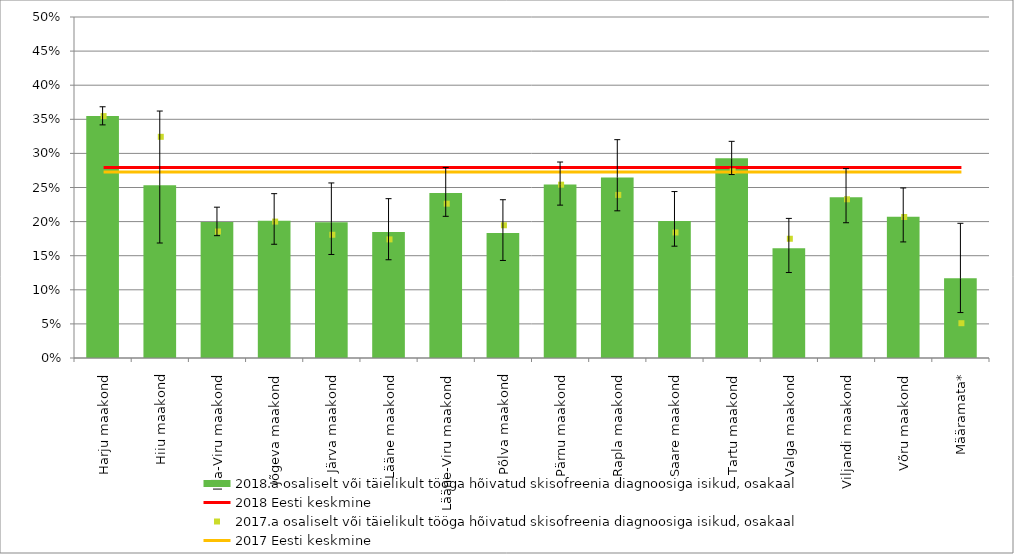
| Category | 2018.a osaliselt või täielikult tööga hõivatud skisofreenia diagnoosiga isikud, osakaal |
|---|---|
| Harju maakond | 0.355 |
| Hiiu maakond | 0.253 |
| Ida-Viru maakond | 0.199 |
| Jõgeva maakond | 0.201 |
| Järva maakond | 0.199 |
| Lääne maakond | 0.185 |
| Lääne-Viru maakond | 0.242 |
| Põlva maakond | 0.183 |
| Pärnu maakond | 0.254 |
| Rapla maakond | 0.265 |
| Saare maakond | 0.201 |
| Tartu maakond | 0.293 |
| Valga maakond | 0.161 |
| Viljandi maakond | 0.236 |
| Võru maakond | 0.207 |
| Määramata* | 0.117 |